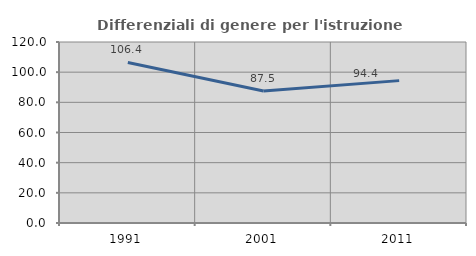
| Category | Differenziali di genere per l'istruzione superiore |
|---|---|
| 1991.0 | 106.446 |
| 2001.0 | 87.457 |
| 2011.0 | 94.395 |